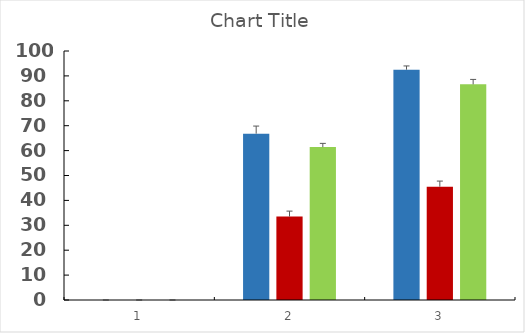
| Category | Series 0 | Series 1 | Series 2 |
|---|---|---|---|
| 0 | 0 | 0 | 0 |
| 1 | 66.8 | 33.5 | 61.4 |
| 2 | 92.5 | 45.5 | 86.6 |